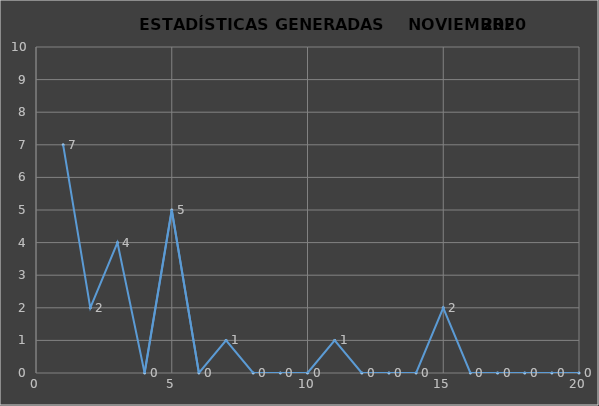
| Category |                   ESTADÍSTICAS GENERADAS     PERÍODO NOVIEMBRE 2020 CANTIDAD |
|---|---|
| 0 | 7 |
| 1 | 2 |
| 2 | 4 |
| 3 | 0 |
| 4 | 5 |
| 5 | 0 |
| 6 | 1 |
| 7 | 0 |
| 8 | 0 |
| 9 | 0 |
| 10 | 1 |
| 11 | 0 |
| 12 | 0 |
| 13 | 0 |
| 14 | 2 |
| 15 | 0 |
| 16 | 0 |
| 17 | 0 |
| 18 | 0 |
| 19 | 0 |